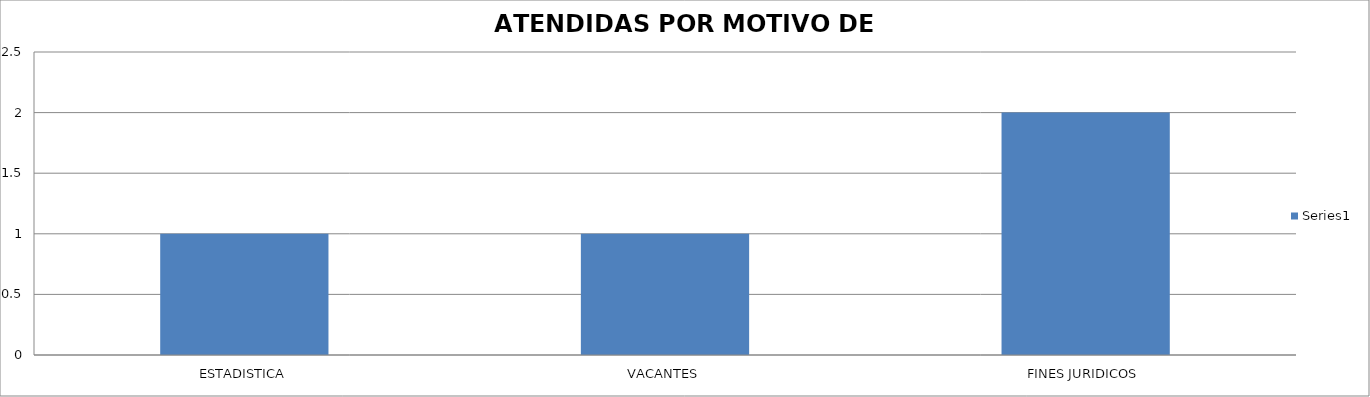
| Category | Series 0 |
|---|---|
| ESTADISTICA | 1 |
| VACANTES | 1 |
| FINES JURIDICOS | 2 |